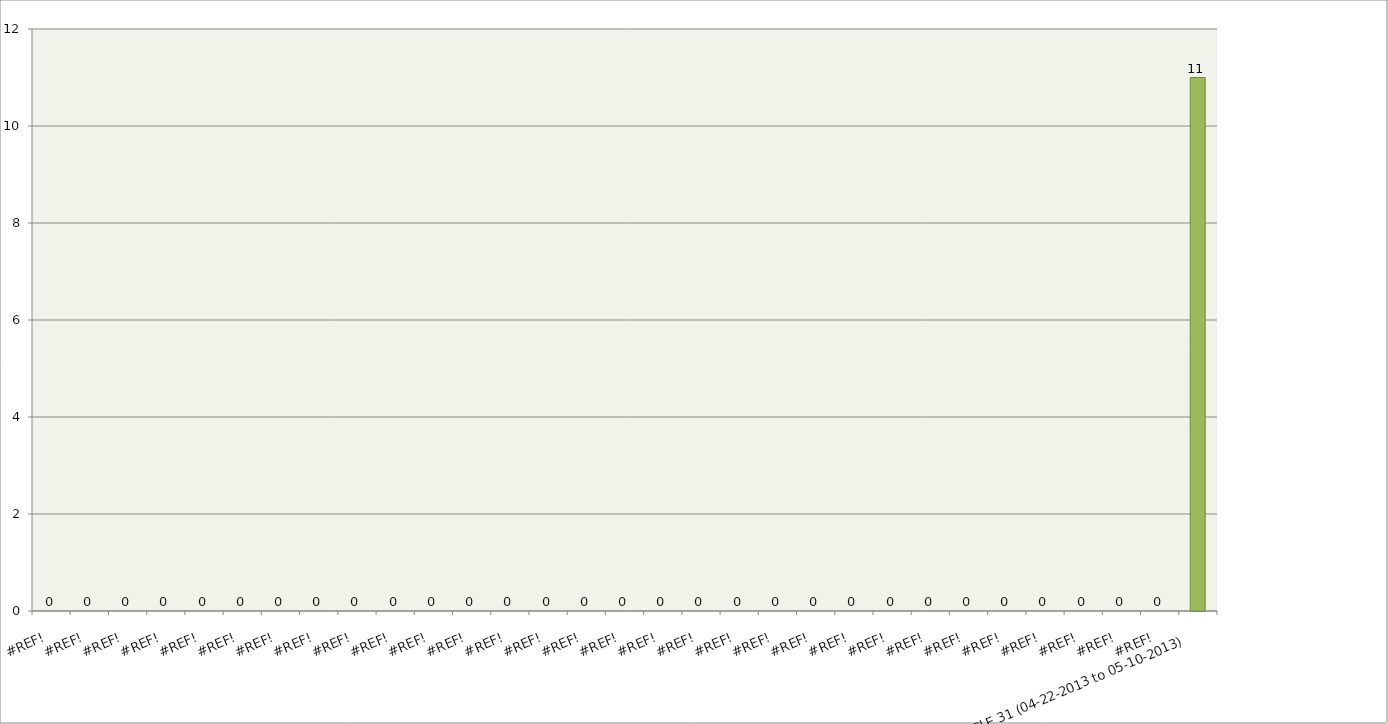
| Category | Series 0 |
|---|---|
| #REF! | 0 |
| #REF! | 0 |
| #REF! | 0 |
| #REF! | 0 |
| #REF! | 0 |
| #REF! | 0 |
| #REF! | 0 |
| #REF! | 0 |
| #REF! | 0 |
| #REF! | 0 |
| #REF! | 0 |
| #REF! | 0 |
| #REF! | 0 |
| #REF! | 0 |
| #REF! | 0 |
| #REF! | 0 |
| #REF! | 0 |
| #REF! | 0 |
| #REF! | 0 |
| #REF! | 0 |
| #REF! | 0 |
| #REF! | 0 |
| #REF! | 0 |
| #REF! | 0 |
| #REF! | 0 |
| #REF! | 0 |
| #REF! | 0 |
| #REF! | 0 |
| #REF! | 0 |
| #REF! | 0 |
| CYCLE 31 (04-22-2013 to 05-10-2013) | 11 |